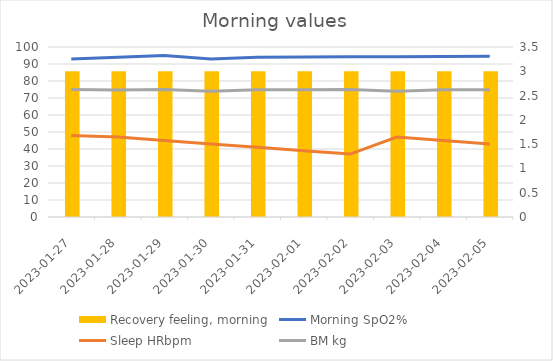
| Category | Recovery feeling, morning |
|---|---|
| 2023-01-27 | 3 |
| 2023-01-28 | 3 |
| 2023-01-29 | 3 |
| 2023-01-30 | 3 |
| 2023-01-31 | 3 |
| 2023-02-01 | 3 |
| 2023-02-02 | 3 |
| 2023-02-03 | 3 |
| 2023-02-04 | 3 |
| 2023-02-05 | 3 |